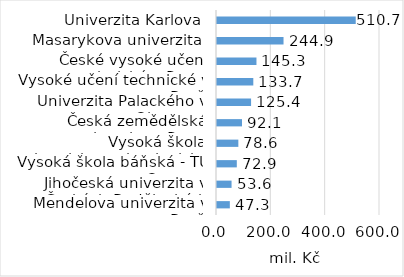
| Category | Series 0 |
|---|---|
| Mendelova univerzita v Brně | 47.25 |
| Jihočeská univerzita v Českých Budějovicích | 53.595 |
| Vysoká škola báňská - TU Ostrava | 72.9 |
| Vysoká škola chemicko-technologická | 78.57 |
| Česká zemědělská univerzita v Praze | 92.07 |
| Univerzita Palackého v Olomouci | 125.415 |
| Vysoké učení technické v Brně | 133.65 |
| České vysoké učení technické v Praze | 145.26 |
| Masarykova univerzita | 244.89 |
| Univerzita Karlova | 510.705 |